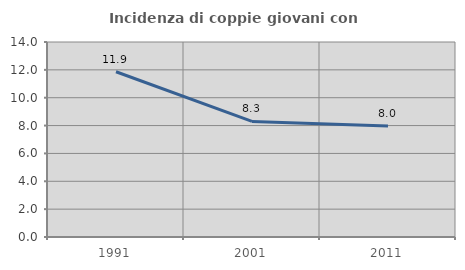
| Category | Incidenza di coppie giovani con figli |
|---|---|
| 1991.0 | 11.863 |
| 2001.0 | 8.299 |
| 2011.0 | 7.977 |